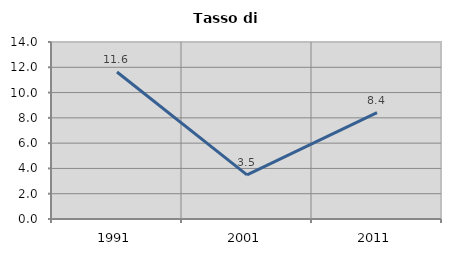
| Category | Tasso di disoccupazione   |
|---|---|
| 1991.0 | 11.628 |
| 2001.0 | 3.488 |
| 2011.0 | 8.421 |